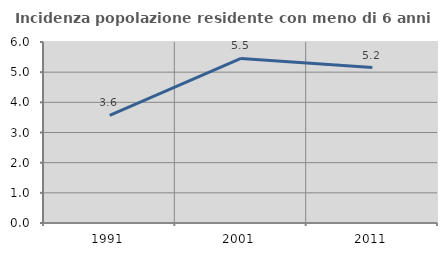
| Category | Incidenza popolazione residente con meno di 6 anni |
|---|---|
| 1991.0 | 3.567 |
| 2001.0 | 5.455 |
| 2011.0 | 5.152 |